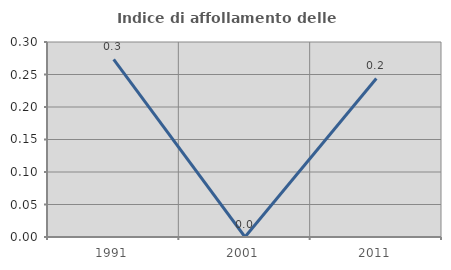
| Category | Indice di affollamento delle abitazioni  |
|---|---|
| 1991.0 | 0.273 |
| 2001.0 | 0 |
| 2011.0 | 0.244 |